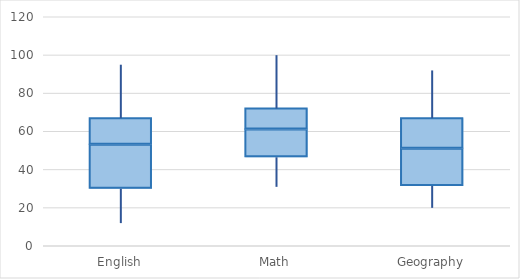
| Category | Minimum Value | First Quartile-Minimum | Median-First Quartile | Third Quartile-Median | Maximum-Third Quartile |
|---|---|---|---|---|---|
| English | 12 | 18 | 23 | 14 | 28 |
| Math | 31 | 15.5 | 14.5 | 11 | 28 |
| Geography | 20 | 11.5 | 19.5 | 16 | 25 |